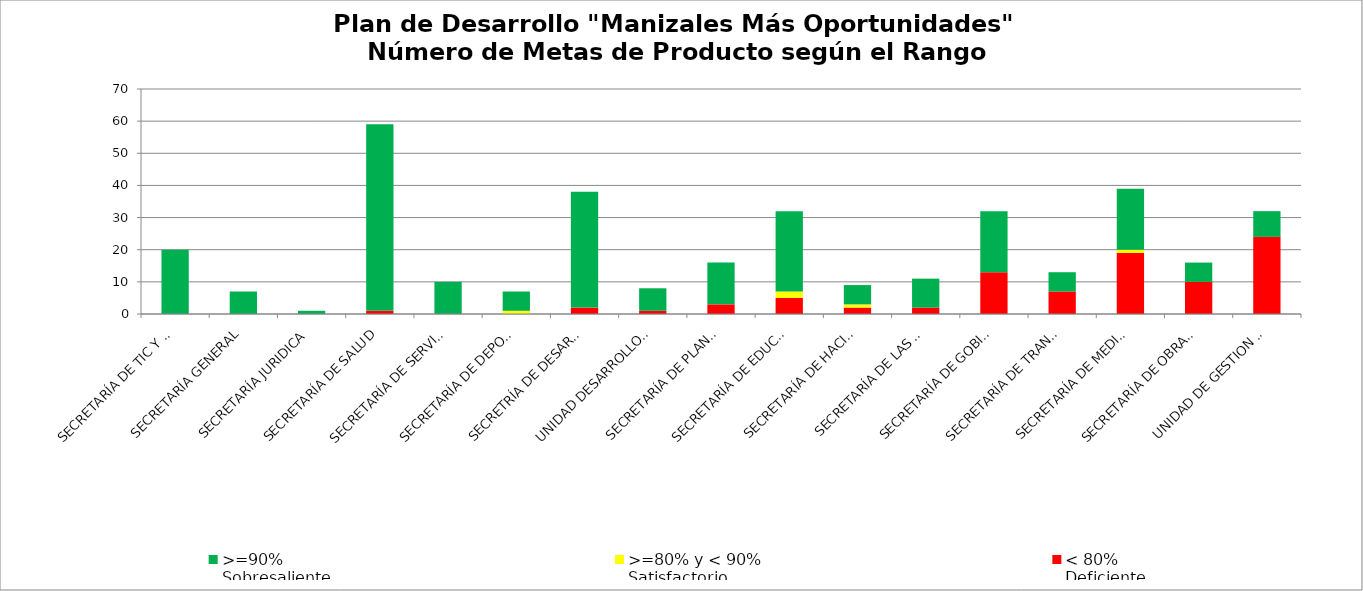
| Category | < 80% 
Deficiente

No. Metas | >=80% y < 90% 
Satisfactorio

No. Metas | >=90% 
Sobresaliente

No. Metas |
|---|---|---|---|
| SECRETARÍA DE TIC Y COMPETITIVIDAD | 0 | 0 | 20 |
| SECRETARÍA GENERAL | 0 | 0 | 7 |
| SECRETARÍA JURIDICA | 0 | 0 | 1 |
| SECRETARÍA DE SALUD | 1 | 0 | 58 |
| SECRETARÍA DE SERVICIOS ADMINISTRATIVOS | 0 | 0 | 10 |
| SECRETARÍA DE DEPORTE | 0 | 1 | 6 |
| SECRETRÍA DE DESARROLLO SOCIAL | 2 | 0 | 36 |
| UNIDAD DESARROLLO RURAL | 1 | 0 | 7 |
| SECRETARÍA DE PLANEACIÓN | 3 | 0 | 13 |
| SECRETARÍA DE EDUCACIÓN | 5 | 2 | 25 |
| SECRETARÍA DE HACIENDA | 2 | 1 | 6 |
| SECRETARÍA DE LAS MUJERES Y EQUIDAD DE GÉNERO | 2 | 0 | 9 |
| SECRETARÍA DE GOBIERNO | 13 | 0 | 19 |
| SECRETARÍA DE TRANSITO Y TRANSPORTE | 7 | 0 | 6 |
| SECRETARÍA DE MEDIO AMBIENTE | 19 | 1 | 19 |
| SECRETARÍA DE OBRAS PÚBLICAS | 10 | 0 | 6 |
| UNIDAD DE GESTION DEL RIESGO | 24 | 0 | 8 |